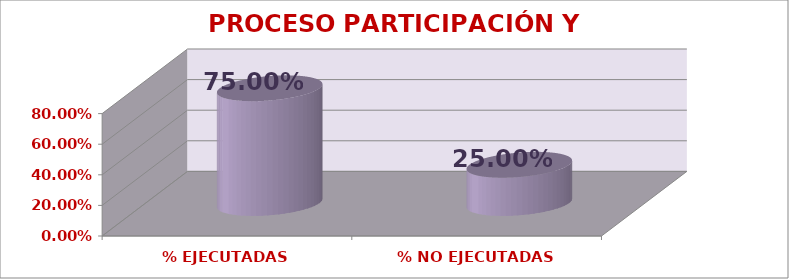
| Category | PROCESO PARTICIPACIÓN Y CONVIVENCIA |
|---|---|
| % EJECUTADAS | 0.75 |
| % NO EJECUTADAS | 0.25 |